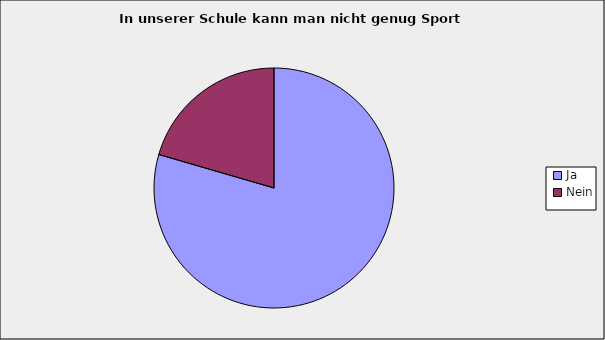
| Category | Series 0 |
|---|---|
| Ja | 0.795 |
| Nein | 0.205 |